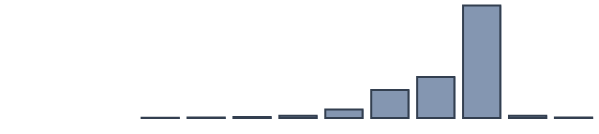
| Category | Series 0 |
|---|---|
| 0 | 0 |
| 1 | 0 |
| 2 | 0 |
| 3 | 0.1 |
| 4 | 0.2 |
| 5 | 0.5 |
| 6 | 1.1 |
| 7 | 4.3 |
| 8 | 14.3 |
| 9 | 20.9 |
| 10 | 57.2 |
| 11 | 1.1 |
| 12 | 0.2 |